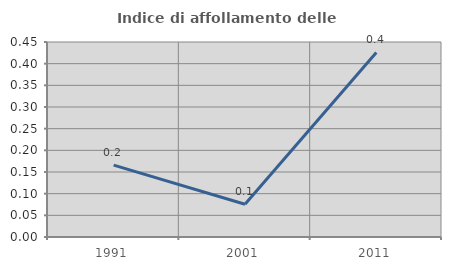
| Category | Indice di affollamento delle abitazioni  |
|---|---|
| 1991.0 | 0.166 |
| 2001.0 | 0.076 |
| 2011.0 | 0.426 |